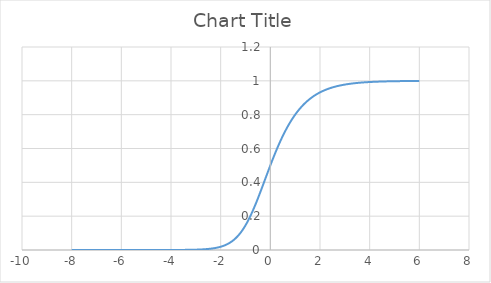
| Category | Series 0 |
|---|---|
| -8.0 | 0 |
| -7.95 | 0 |
| -7.9 | 0 |
| -7.85 | 0 |
| -7.8 | 0 |
| -7.75 | 0 |
| -7.7 | 0 |
| -7.65 | 0 |
| -7.6 | 0 |
| -7.55 | 0 |
| -7.5 | 0 |
| -7.45 | 0 |
| -7.4 | 0 |
| -7.35 | 0 |
| -7.3 | 0 |
| -7.25 | 0 |
| -7.2 | 0 |
| -7.15 | 0 |
| -7.1 | 0 |
| -7.05 | 0 |
| -7.0 | 0 |
| -6.95 | 0 |
| -6.9 | 0 |
| -6.85 | 0 |
| -6.8 | 0 |
| -6.75 | 0 |
| -6.7 | 0 |
| -6.65 | 0 |
| -6.6 | 0 |
| -6.55000000000001 | 0 |
| -6.50000000000001 | 0 |
| -6.45000000000001 | 0 |
| -6.40000000000001 | 0 |
| -6.35000000000001 | 0 |
| -6.30000000000001 | 0 |
| -6.25000000000001 | 0 |
| -6.20000000000001 | 0 |
| -6.15000000000001 | 0 |
| -6.10000000000001 | 0 |
| -6.05000000000001 | 0 |
| -6.00000000000001 | 0 |
| -5.95000000000001 | 0 |
| -5.90000000000001 | 0 |
| -5.85000000000001 | 0 |
| -5.80000000000001 | 0 |
| -5.75000000000001 | 0 |
| -5.70000000000001 | 0 |
| -5.65000000000001 | 0 |
| -5.60000000000001 | 0 |
| -5.55000000000001 | 0 |
| -5.50000000000001 | 0 |
| -5.45000000000001 | 0 |
| -5.40000000000001 | 0 |
| -5.35000000000001 | 0 |
| -5.30000000000001 | 0 |
| -5.25000000000001 | 0 |
| -5.20000000000001 | 0 |
| -5.15000000000001 | 0 |
| -5.10000000000001 | 0 |
| -5.05000000000001 | 0 |
| -5.00000000000001 | 0 |
| -4.95000000000001 | 0 |
| -4.90000000000001 | 0 |
| -4.85000000000001 | 0 |
| -4.80000000000001 | 0 |
| -4.75000000000001 | 0 |
| -4.70000000000001 | 0 |
| -4.65000000000001 | 0 |
| -4.60000000000001 | 0 |
| -4.55000000000001 | 0 |
| -4.50000000000001 | 0 |
| -4.45000000000001 | 0 |
| -4.40000000000001 | 0 |
| -4.35000000000001 | 0 |
| -4.30000000000001 | 0 |
| -4.25000000000001 | 0 |
| -4.20000000000001 | 0 |
| -4.15000000000001 | 0 |
| -4.10000000000001 | 0 |
| -4.05000000000001 | 0 |
| -4.00000000000001 | 0 |
| -3.95000000000001 | 0 |
| -3.90000000000001 | 0 |
| -3.85000000000001 | 0 |
| -3.80000000000001 | 0 |
| -3.75000000000002 | 0 |
| -3.70000000000002 | 0 |
| -3.65000000000002 | 0 |
| -3.60000000000002 | 0.001 |
| -3.55000000000002 | 0.001 |
| -3.50000000000002 | 0.001 |
| -3.45000000000002 | 0.001 |
| -3.40000000000002 | 0.001 |
| -3.35000000000002 | 0.001 |
| -3.30000000000002 | 0.001 |
| -3.25000000000002 | 0.001 |
| -3.20000000000002 | 0.001 |
| -3.15000000000002 | 0.001 |
| -3.10000000000002 | 0.002 |
| -3.05000000000002 | 0.002 |
| -3.00000000000002 | 0.002 |
| -2.95000000000002 | 0.002 |
| -2.90000000000002 | 0.003 |
| -2.85000000000002 | 0.003 |
| -2.80000000000002 | 0.003 |
| -2.75000000000002 | 0.004 |
| -2.70000000000002 | 0.004 |
| -2.65000000000002 | 0.004 |
| -2.60000000000002 | 0.005 |
| -2.55000000000002 | 0.006 |
| -2.50000000000002 | 0.006 |
| -2.45000000000002 | 0.007 |
| -2.40000000000002 | 0.008 |
| -2.35000000000002 | 0.009 |
| -2.30000000000002 | 0.01 |
| -2.25000000000002 | 0.011 |
| -2.20000000000002 | 0.012 |
| -2.15000000000002 | 0.014 |
| -2.10000000000002 | 0.015 |
| -2.05000000000002 | 0.017 |
| -2.00000000000002 | 0.019 |
| -1.95000000000002 | 0.021 |
| -1.90000000000002 | 0.024 |
| -1.85000000000002 | 0.027 |
| -1.80000000000002 | 0.03 |
| -1.75000000000002 | 0.033 |
| -1.70000000000002 | 0.037 |
| -1.65000000000002 | 0.041 |
| -1.60000000000002 | 0.046 |
| -1.55000000000002 | 0.051 |
| -1.50000000000002 | 0.056 |
| -1.45000000000002 | 0.062 |
| -1.40000000000002 | 0.069 |
| -1.35000000000002 | 0.076 |
| -1.30000000000002 | 0.084 |
| -1.25000000000002 | 0.093 |
| -1.20000000000002 | 0.102 |
| -1.15000000000002 | 0.112 |
| -1.10000000000002 | 0.122 |
| -1.05000000000002 | 0.134 |
| -1.00000000000002 | 0.146 |
| -0.95000000000003 | 0.159 |
| -0.90000000000003 | 0.172 |
| -0.85000000000003 | 0.187 |
| -0.80000000000003 | 0.202 |
| -0.75000000000003 | 0.218 |
| -0.70000000000003 | 0.234 |
| -0.65000000000003 | 0.251 |
| -0.60000000000003 | 0.269 |
| -0.55000000000003 | 0.287 |
| -0.50000000000003 | 0.305 |
| -0.45000000000003 | 0.324 |
| -0.40000000000003 | 0.343 |
| -0.35000000000003 | 0.363 |
| -0.30000000000003 | 0.382 |
| -0.25000000000003 | 0.402 |
| -0.20000000000003 | 0.422 |
| -0.15000000000003 | 0.442 |
| -0.10000000000003 | 0.461 |
| -0.05000000000003 | 0.481 |
| -3.01980662698043e-14 | 0.5 |
| 0.0499999999999705 | 0.519 |
| 0.0999999999999694 | 0.538 |
| 0.14999999999997 | 0.556 |
| 0.199999999999971 | 0.574 |
| 0.24999999999997 | 0.592 |
| 0.299999999999971 | 0.609 |
| 0.349999999999969 | 0.626 |
| 0.39999999999997 | 0.642 |
| 0.449999999999971 | 0.658 |
| 0.49999999999997 | 0.674 |
| 0.549999999999971 | 0.689 |
| 0.599999999999969 | 0.703 |
| 0.64999999999997 | 0.717 |
| 0.699999999999971 | 0.73 |
| 0.74999999999997 | 0.743 |
| 0.799999999999971 | 0.755 |
| 0.849999999999969 | 0.767 |
| 0.89999999999997 | 0.779 |
| 0.949999999999971 | 0.79 |
| 0.99999999999997 | 0.8 |
| 1.04999999999997 | 0.81 |
| 1.09999999999997 | 0.82 |
| 1.14999999999997 | 0.829 |
| 1.19999999999997 | 0.837 |
| 1.24999999999997 | 0.846 |
| 1.29999999999997 | 0.854 |
| 1.34999999999997 | 0.861 |
| 1.39999999999997 | 0.869 |
| 1.44999999999997 | 0.875 |
| 1.49999999999997 | 0.882 |
| 1.54999999999997 | 0.888 |
| 1.59999999999997 | 0.894 |
| 1.64999999999997 | 0.9 |
| 1.69999999999997 | 0.905 |
| 1.74999999999996 | 0.91 |
| 1.79999999999997 | 0.915 |
| 1.84999999999997 | 0.919 |
| 1.89999999999996 | 0.924 |
| 1.94999999999996 | 0.928 |
| 1.99999999999996 | 0.932 |
| 2.05 | 0.935 |
| 2.1 | 0.939 |
| 2.15 | 0.942 |
| 2.2 | 0.945 |
| 2.25 | 0.948 |
| 2.3 | 0.951 |
| 2.35 | 0.954 |
| 2.4 | 0.956 |
| 2.45 | 0.959 |
| 2.5 | 0.961 |
| 2.55 | 0.963 |
| 2.6 | 0.965 |
| 2.65 | 0.967 |
| 2.7 | 0.969 |
| 2.75 | 0.971 |
| 2.8 | 0.972 |
| 2.85 | 0.974 |
| 2.9 | 0.975 |
| 2.95 | 0.977 |
| 3.0 | 0.978 |
| 3.05 | 0.979 |
| 3.1 | 0.98 |
| 3.15 | 0.981 |
| 3.2 | 0.982 |
| 3.25 | 0.983 |
| 3.3 | 0.984 |
| 3.35 | 0.985 |
| 3.4 | 0.986 |
| 3.45 | 0.987 |
| 3.5 | 0.988 |
| 3.55 | 0.988 |
| 3.6 | 0.989 |
| 3.65 | 0.989 |
| 3.7 | 0.99 |
| 3.75 | 0.991 |
| 3.8 | 0.991 |
| 3.85 | 0.992 |
| 3.9 | 0.992 |
| 3.95 | 0.993 |
| 4.0 | 0.993 |
| 4.05 | 0.993 |
| 4.1 | 0.994 |
| 4.15 | 0.994 |
| 4.2 | 0.994 |
| 4.25 | 0.995 |
| 4.3 | 0.995 |
| 4.35 | 0.995 |
| 4.4 | 0.996 |
| 4.45 | 0.996 |
| 4.5 | 0.996 |
| 4.55 | 0.996 |
| 4.6 | 0.996 |
| 4.65 | 0.997 |
| 4.7 | 0.997 |
| 4.75 | 0.997 |
| 4.8 | 0.997 |
| 4.85 | 0.997 |
| 4.9 | 0.997 |
| 4.95 | 0.998 |
| 5.0 | 0.998 |
| 5.05 | 0.998 |
| 5.1 | 0.998 |
| 5.15 | 0.998 |
| 5.2 | 0.998 |
| 5.25 | 0.998 |
| 5.3 | 0.998 |
| 5.35 | 0.999 |
| 5.4 | 0.999 |
| 5.45 | 0.999 |
| 5.5 | 0.999 |
| 5.55 | 0.999 |
| 5.6 | 0.999 |
| 5.65 | 0.999 |
| 5.7 | 0.999 |
| 5.75 | 0.999 |
| 5.8 | 0.999 |
| 5.85 | 0.999 |
| 5.9 | 0.999 |
| 5.9499999999999 | 0.999 |
| 6.0 | 0.999 |